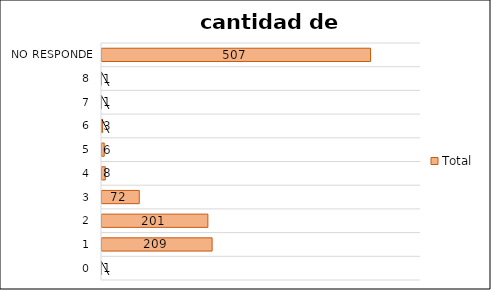
| Category | Total |
|---|---|
| 0 | 1 |
| 1 | 209 |
| 2 | 201 |
| 3 | 72 |
| 4 | 8 |
| 5 | 6 |
| 6 | 3 |
| 7 | 1 |
| 8 | 1 |
| No responde | 507 |